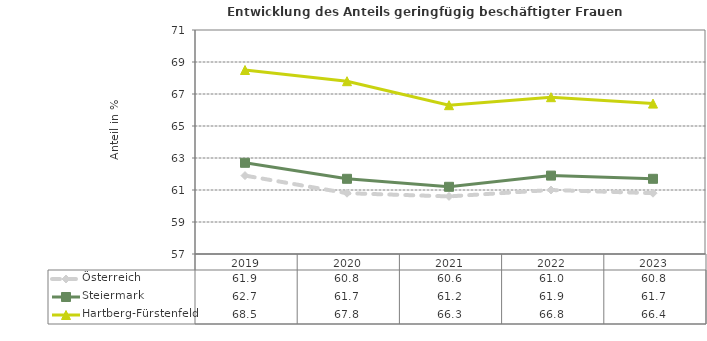
| Category | Österreich | Steiermark | Hartberg-Fürstenfeld |
|---|---|---|---|
| 2023.0 | 60.8 | 61.7 | 66.4 |
| 2022.0 | 61 | 61.9 | 66.8 |
| 2021.0 | 60.6 | 61.2 | 66.3 |
| 2020.0 | 60.8 | 61.7 | 67.8 |
| 2019.0 | 61.9 | 62.7 | 68.5 |